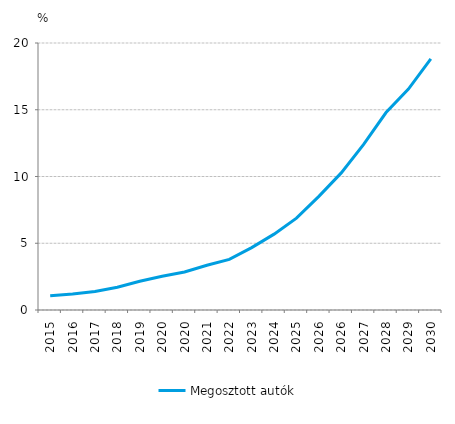
| Category | Megosztott autók |
|---|---|
| 2015.0 | 1.069 |
| 2016.0 | 1.197 |
| 2017.0 | 1.389 |
| 2018.0 | 1.706 |
| 2019.0 | 2.149 |
| 2020.0 | 2.529 |
| 2020.0 | 2.846 |
| 2021.0 | 3.351 |
| 2022.0 | 3.794 |
| 2023.0 | 4.675 |
| 2024.0 | 5.682 |
| 2025.0 | 6.877 |
| 2026.0 | 8.511 |
| 2026.0 | 10.269 |
| 2027.0 | 12.404 |
| 2028.0 | 14.79 |
| 2029.0 | 16.548 |
| 2030.0 | 18.808 |